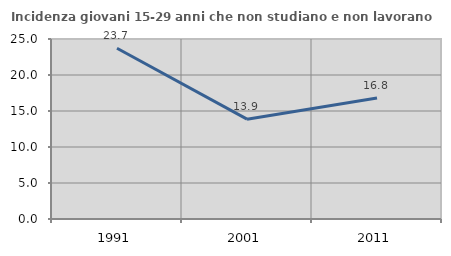
| Category | Incidenza giovani 15-29 anni che non studiano e non lavorano  |
|---|---|
| 1991.0 | 23.711 |
| 2001.0 | 13.864 |
| 2011.0 | 16.82 |